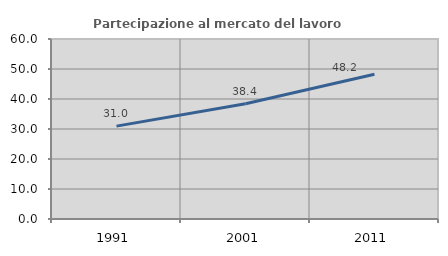
| Category | Partecipazione al mercato del lavoro  femminile |
|---|---|
| 1991.0 | 30.961 |
| 2001.0 | 38.415 |
| 2011.0 | 48.229 |